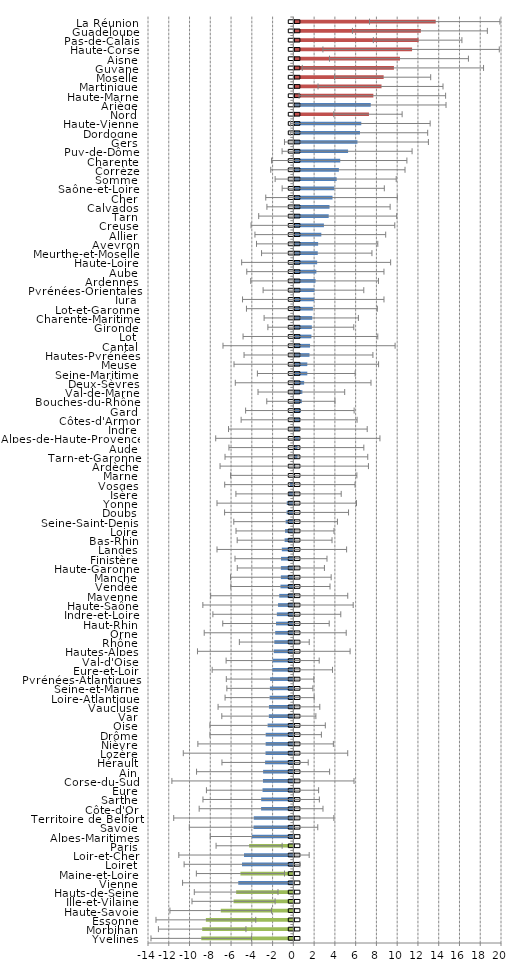
| Category | Series 0 | IC natio1 | IC natio 2 |
|---|---|---|---|
| Yvelines | -8.87 | 0.536 | -0.536 |
| Morbihan | -8.781 | 0.536 | -0.536 |
| Essonne | -8.426 | 0.536 | -0.536 |
| Haute-Savoie | -6.993 | 0.536 | -0.536 |
| Ille-et-Vilaine | -5.76 | 0.536 | -0.536 |
| Hauts-de-Seine | -5.51 | 0.536 | -0.536 |
| Vienne | -5.307 | 0.536 | -0.536 |
| Maine-et-Loire | -5.098 | 0.536 | -0.536 |
| Loiret | -4.945 | 0.536 | -0.536 |
| Loir-et-Cher | -4.755 | 0.536 | -0.536 |
| Paris | -4.261 | 0.536 | -0.536 |
| Alpes-Maritimes | -3.986 | 0.536 | -0.536 |
| Savoie | -3.834 | 0.536 | -0.536 |
| Territoire de Belfort | -3.812 | 0.536 | -0.536 |
| Côte-d'Or | -3.109 | 0.536 | -0.536 |
| Sarthe | -3.101 | 0.536 | -0.536 |
| Eure | -2.97 | 0.536 | -0.536 |
| Corse-du-Sud | -2.928 | 0.536 | -0.536 |
| Ain | -2.916 | 0.536 | -0.536 |
| Hérault | -2.722 | 0.536 | -0.536 |
| Lozère | -2.683 | 0.536 | -0.536 |
| Nièvre | -2.671 | 0.536 | -0.536 |
| Drôme | -2.667 | 0.536 | -0.536 |
| Oise | -2.48 | 0.536 | -0.536 |
| Var | -2.361 | 0.536 | -0.536 |
| Vaucluse | -2.352 | 0.536 | -0.536 |
| Loire-Atlantique | -2.286 | 0.536 | -0.536 |
| Seine-et-Marne | -2.261 | 0.536 | -0.536 |
| Pyrénées-Atlantiques | -2.242 | 0.536 | -0.536 |
| Eure-et-Loir | -2.024 | 0.536 | -0.536 |
| Val-d'Oise | -1.994 | 0.536 | -0.536 |
| Hautes-Alpes | -1.884 | 0.536 | -0.536 |
| Rhône | -1.834 | 0.536 | -0.536 |
| Orne | -1.748 | 0.536 | -0.536 |
| Haut-Rhin | -1.674 | 0.536 | -0.536 |
| Indre-et-Loire | -1.591 | 0.536 | -0.536 |
| Haute-Saône | -1.476 | 0.536 | -0.536 |
| Mayenne | -1.362 | 0.536 | -0.536 |
| Vendée | -1.245 | 0.536 | -0.536 |
| Manche | -1.204 | 0.536 | -0.536 |
| Haute-Garonne | -1.204 | 0.536 | -0.536 |
| Finistère | -1.191 | 0.536 | -0.536 |
| Landes | -1.112 | 0.536 | -0.536 |
| Bas-Rhin | -0.843 | 0.536 | -0.536 |
| Loire | -0.803 | 0.536 | -0.536 |
| Seine-Saint-Denis | -0.745 | 0.536 | -0.536 |
| Doubs | -0.653 | 0.536 | -0.536 |
| Yonne | -0.636 | 0.536 | -0.536 |
| Isère | -0.461 | 0.536 | -0.536 |
| Vosges | -0.334 | 0.536 | -0.536 |
| Marne | 0.038 | 0.536 | -0.536 |
| Ardèche | 0.086 | 0.536 | -0.536 |
| Tarn-et-Garonne | 0.293 | 0.536 | -0.536 |
| Aude | 0.293 | 0.536 | -0.536 |
| Alpes-de-Haute-Provence | 0.431 | 0.536 | -0.536 |
| Indre | 0.435 | 0.536 | -0.536 |
| Côtes-d'Armor | 0.554 | 0.536 | -0.536 |
| Gard | 0.628 | 0.536 | -0.536 |
| Bouches-du-Rhône | 0.724 | 0.536 | -0.536 |
| Val-de-Marne | 0.77 | 0.536 | -0.536 |
| Deux-Sèvres | 0.942 | 0.536 | -0.536 |
| Seine-Maritime | 1.245 | 0.536 | -0.536 |
| Meuse | 1.247 | 0.536 | -0.536 |
| Hautes-Pyrénées | 1.457 | 0.536 | -0.536 |
| Cantal | 1.512 | 0.536 | -0.536 |
| Lot | 1.644 | 0.536 | -0.536 |
| Gironde | 1.684 | 0.536 | -0.536 |
| Charente-Maritime | 1.723 | 0.536 | -0.536 |
| Lot-et-Garonne | 1.786 | 0.536 | -0.536 |
| Jura | 1.917 | 0.536 | -0.536 |
| Pyrénées-Orientales | 1.935 | 0.536 | -0.536 |
| Ardennes | 2.046 | 0.536 | -0.536 |
| Aube | 2.121 | 0.536 | -0.536 |
| Haute-Loire | 2.196 | 0.536 | -0.536 |
| Meurthe-et-Moselle | 2.254 | 0.536 | -0.536 |
| Aveyron | 2.292 | 0.536 | -0.536 |
| Allier | 2.597 | 0.536 | -0.536 |
| Creuse | 2.848 | 0.536 | -0.536 |
| Tarn | 3.308 | 0.536 | -0.536 |
| Calvados | 3.387 | 0.536 | -0.536 |
| Cher | 3.677 | 0.536 | -0.536 |
| Saône-et-Loire | 3.842 | 0.536 | -0.536 |
| Somme | 4.077 | 0.536 | -0.536 |
| Corrèze | 4.29 | 0.536 | -0.536 |
| Charente | 4.419 | 0.536 | -0.536 |
| Puy-de-Dôme | 5.175 | 0.536 | -0.536 |
| Gers | 6.077 | 0.536 | -0.536 |
| Dordogne | 6.32 | 0.536 | -0.536 |
| Haute-Vienne | 6.447 | 0.536 | -0.536 |
| Nord | 7.186 | 0.536 | -0.536 |
| Ariège | 7.359 | 0.536 | -0.536 |
| Haute-Marne | 7.609 | 0.536 | -0.536 |
| Martinique | 8.396 | 0.536 | -0.536 |
| Moselle | 8.601 | 0.536 | -0.536 |
| Guyane | 9.591 | 0.536 | -0.536 |
| Aisne | 10.173 | 0.536 | -0.536 |
| Haute-Corse | 11.341 | 0.536 | -0.536 |
| Pas-de-Calais | 11.969 | 0.536 | -0.536 |
| Guadeloupe | 12.187 | 0.536 | -0.536 |
| La Réunion | 13.617 | 0.536 | -0.536 |